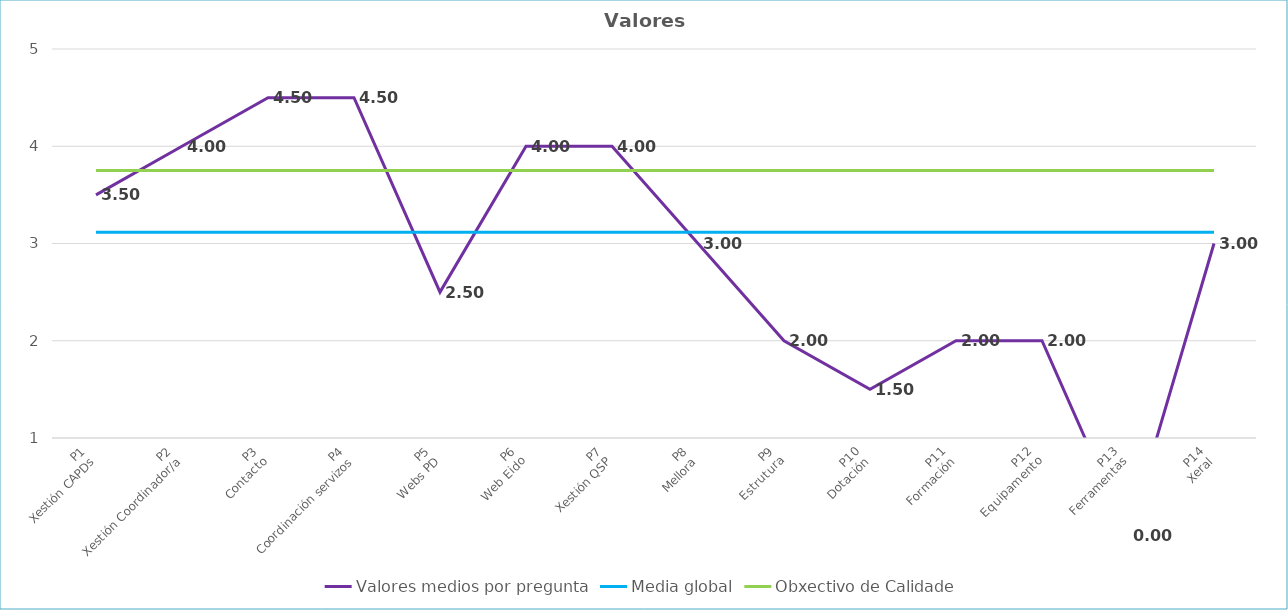
| Category | Valores medios por pregunta | Media global | Obxectivo de Calidade |
|---|---|---|---|
| P1
Xestión CAPDs | 3.5 | 3.115 | 3.75 |
| P2
Xestión Coordinador/a | 4 | 3.115 | 3.75 |
| P3
Contacto | 4.5 | 3.115 | 3.75 |
| P4
Coordinación servizos | 4.5 | 3.115 | 3.75 |
| P5
Webs PD | 2.5 | 3.115 | 3.75 |
| P6
Web Eido | 4 | 3.115 | 3.75 |
| P7
Xestión QSP | 4 | 3.115 | 3.75 |
| P8
Mellora | 3 | 3.115 | 3.75 |
| P9
Estrutura | 2 | 3.115 | 3.75 |
| P10
Dotación | 1.5 | 3.115 | 3.75 |
| P11
Formación | 2 | 3.115 | 3.75 |
| P12
Equipamento | 2 | 3.115 | 3.75 |
| P13
Ferramentas | 0 | 3.115 | 3.75 |
| P14
Xeral | 3 | 3.115 | 3.75 |